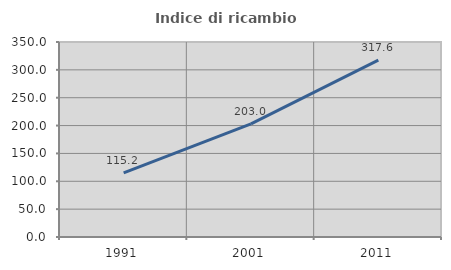
| Category | Indice di ricambio occupazionale  |
|---|---|
| 1991.0 | 115.2 |
| 2001.0 | 202.97 |
| 2011.0 | 317.582 |